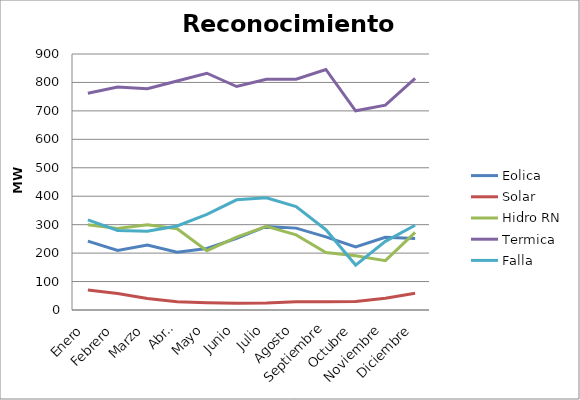
| Category | Eolica | Solar | Hidro RN | Termica | Falla |
|---|---|---|---|---|---|
| Enero | 242.159 | 70.526 | 299.882 | 762.025 | 317.01 |
| Febrero | 209.385 | 58.055 | 286.39 | 783.711 | 279.677 |
| Marzo | 228.685 | 40.325 | 299.924 | 777.75 | 276.598 |
| Abril | 203.121 | 29.2 | 285.563 | 804.958 | 295.415 |
| Mayo | 216.221 | 25.889 | 208.542 | 832.388 | 336.345 |
| Junio | 251.955 | 23.593 | 256.059 | 785.633 | 387.408 |
| Julio | 293.891 | 24.542 | 293.8 | 810.985 | 394.708 |
| Agosto | 287.883 | 29.262 | 264.002 | 811.378 | 363.912 |
| Septiembre | 257.297 | 28.788 | 201.87 | 845.638 | 282.294 |
| Octubre | 221.793 | 30.229 | 190.391 | 700.402 | 157.994 |
| Noviembre | 255.571 | 41.451 | 173.36 | 719.91 | 241.339 |
| Diciembre | 251.448 | 58.55 | 272.87 | 814.239 | 297.888 |